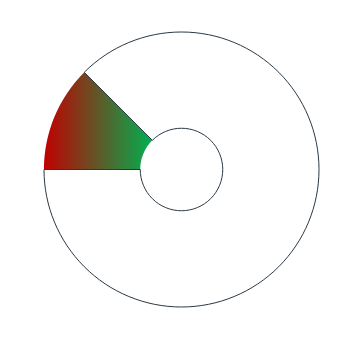
| Category | Series 0 |
|---|---|
| 0 | 45 |
| 1 | 315 |